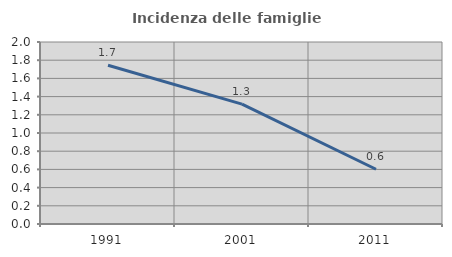
| Category | Incidenza delle famiglie numerose |
|---|---|
| 1991.0 | 1.744 |
| 2001.0 | 1.317 |
| 2011.0 | 0.602 |